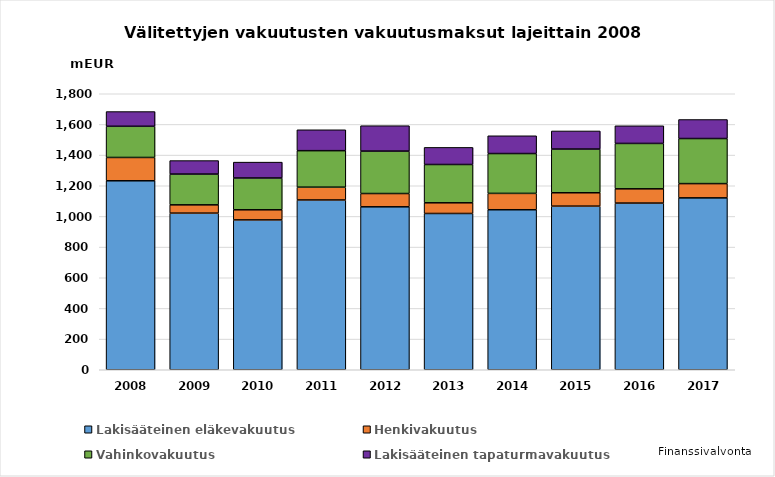
| Category | Lakisääteinen eläkevakuutus | Henkivakuutus | Vahinkovakuutus | Lakisääteinen tapaturmavakuutus |
|---|---|---|---|---|
| 2008.0 | 1232.449 | 151.996 | 203.425 | 95.962 |
| 2009.0 | 1021.457 | 54.107 | 200.56 | 88.041 |
| 2010.0 | 977.321 | 65.95 | 207.341 | 103.558 |
| 2011.0 | 1107.329 | 83.403 | 238.041 | 136.289 |
| 2012.0 | 1062.705 | 86.597 | 276.62 | 165.706 |
| 2013.0 | 1019.216 | 69.648 | 249.823 | 111.515 |
| 2014.0 | 1043.573 | 106.619 | 259.835 | 115.957 |
| 2015.0 | 1067.062 | 87.285 | 284.943 | 118.153 |
| 2016.0 | 1087 | 93 | 296 | 115 |
| 2017.0 | 1121 | 93 | 294 | 124 |